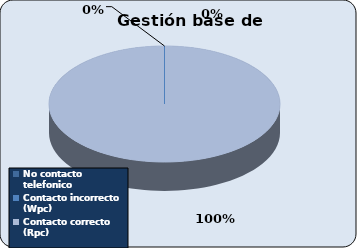
| Category | Series 0 |
|---|---|
| No contacto telefonico | 0 |
| Contacto incorrecto (Wpc) | 0 |
| Contacto correcto (Rpc) | 1324 |